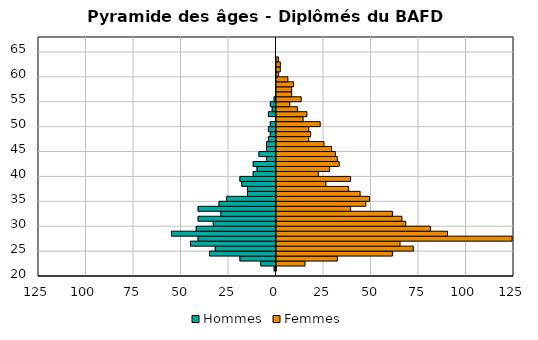
| Category | Hommes | Femmes |
|---|---|---|
| 20.0 | 0 | 0 |
| 21.0 | -1 | 0 |
| 22.0 | -8 | 15 |
| 23.0 | -19 | 32 |
| 24.0 | -35 | 61 |
| 25.0 | -32 | 72 |
| 26.0 | -45 | 65 |
| 27.0 | -41 | 124 |
| 28.0 | -55 | 90 |
| 29.0 | -42 | 81 |
| 30.0 | -33 | 68 |
| 31.0 | -41 | 66 |
| 32.0 | -29 | 61 |
| 33.0 | -41 | 39 |
| 34.0 | -30 | 47 |
| 35.0 | -26 | 49 |
| 36.0 | -15 | 44 |
| 37.0 | -15 | 38 |
| 38.0 | -18 | 26 |
| 39.0 | -19 | 39 |
| 40.0 | -12 | 22 |
| 41.0 | -10 | 28 |
| 42.0 | -12 | 33 |
| 43.0 | -5 | 32 |
| 44.0 | -9 | 31 |
| 45.0 | -5 | 29 |
| 46.0 | -5 | 25 |
| 47.0 | -4 | 17 |
| 48.0 | -3 | 18 |
| 49.0 | -4 | 17 |
| 50.0 | -3 | 23 |
| 51.0 | 0 | 14 |
| 52.0 | -4 | 16 |
| 53.0 | -2 | 11 |
| 54.0 | -3 | 7 |
| 55.0 | -1 | 13 |
| 56.0 | 0 | 8 |
| 57.0 | 0 | 8 |
| 58.0 | 0 | 9 |
| 59.0 | 0 | 6 |
| 60.0 | 0 | 1 |
| 61.0 | 0 | 2 |
| 62.0 | 0 | 2 |
| 63.0 | 0 | 1 |
| 64.0 | 0 | 0 |
| 65.0 | 0 | 0 |
| 67.0 | 0 | 0 |
| 69.0 | 0 | 0 |